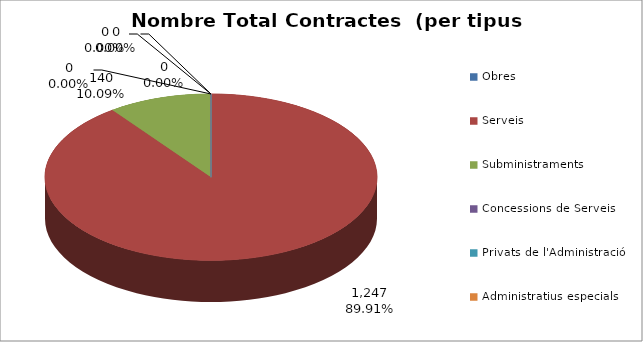
| Category | Nombre Total Contractes |
|---|---|
| Obres | 0 |
| Serveis | 1247 |
| Subministraments | 140 |
| Concessions de Serveis | 0 |
| Privats de l'Administració | 0 |
| Administratius especials | 0 |